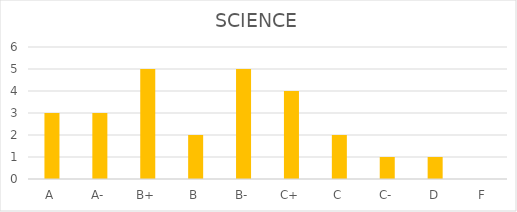
| Category | SCIENCE |
|---|---|
| A | 3 |
| A- | 3 |
| B+ | 5 |
| B | 2 |
| B- | 5 |
| C+ | 4 |
| C | 2 |
| C- | 1 |
| D | 1 |
| F | 0 |